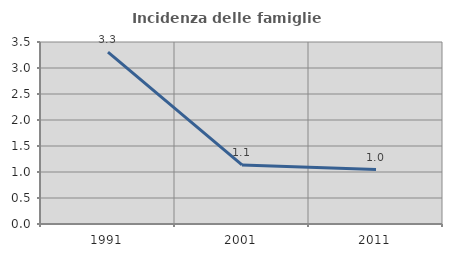
| Category | Incidenza delle famiglie numerose |
|---|---|
| 1991.0 | 3.303 |
| 2001.0 | 1.136 |
| 2011.0 | 1.048 |